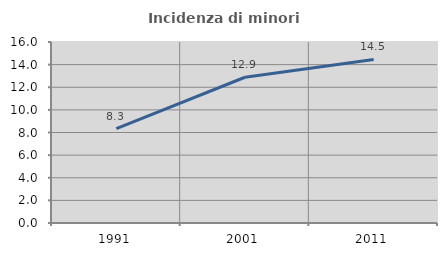
| Category | Incidenza di minori stranieri |
|---|---|
| 1991.0 | 8.333 |
| 2001.0 | 12.883 |
| 2011.0 | 14.461 |